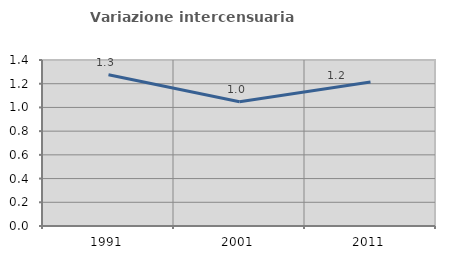
| Category | Variazione intercensuaria annua |
|---|---|
| 1991.0 | 1.275 |
| 2001.0 | 1.048 |
| 2011.0 | 1.214 |